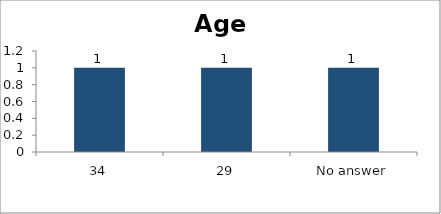
| Category | Age |
|---|---|
| 34 | 1 |
| 29 | 1 |
| No answer | 1 |